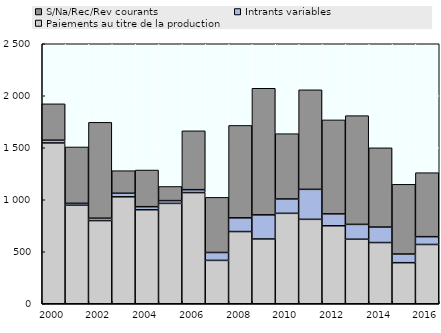
| Category | Paiements au titre de la production | Intrants variables | S/Na/Rec/Rev courants |
|---|---|---|---|
| 2000.0 | 1546.412 | 26.259 | 349.727 |
| 2001.0 | 946.983 | 18.567 | 542.109 |
| 2002.0 | 799.587 | 23.118 | 921.822 |
| 2003.0 | 1028.277 | 34.149 | 217.029 |
| 2004.0 | 904.009 | 29.18 | 352.649 |
| 2005.0 | 965.036 | 26.793 | 135.847 |
| 2006.0 | 1068.733 | 28.062 | 566.11 |
| 2007.0 | 417.02 | 75.846 | 530.042 |
| 2008.0 | 694.147 | 132.15 | 888.391 |
| 2009.0 | 622.902 | 232.009 | 1217.202 |
| 2010.0 | 869.566 | 137.959 | 627.866 |
| 2011.0 | 811.895 | 288.241 | 957.032 |
| 2012.0 | 749.906 | 114.261 | 903.59 |
| 2013.0 | 620.604 | 142.694 | 1045.582 |
| 2014.0 | 588.627 | 148.822 | 761.933 |
| 2015.0 | 394.949 | 83.159 | 670.429 |
| 2016.0 | 569.924 | 75.075 | 615.282 |